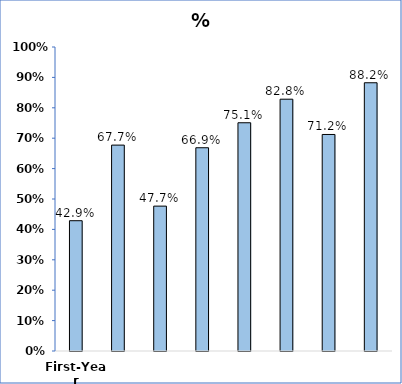
| Category | % Enrolled |
|---|---|
| First-Year | 0.429 |
| Transfer | 0.677 |
| Graduate | 0.477 |
| Law | 0.669 |
| Medical | 0.751 |
| Dental | 0.828 |
| Pharmacy | 0.712 |
| Nursing | 0.882 |